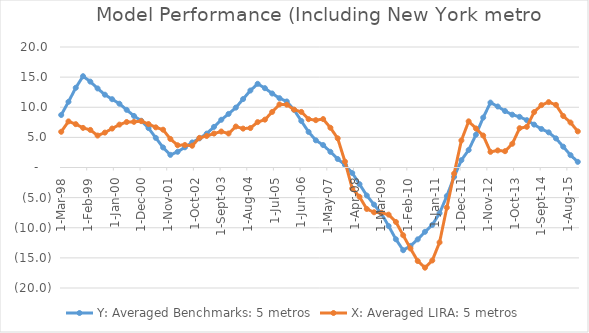
| Category | Y: Averaged Benchmarks: 5 metros | X: Averaged LIRA: 5 metros |
|---|---|---|
| 1998-03-31 | 8.719 | 5.93 |
| 1998-06-30 | 10.907 | 7.652 |
| 1998-09-30 | 13.227 | 7.194 |
| 1998-12-31 | 15.152 | 6.575 |
| 1999-03-31 | 14.253 | 6.238 |
| 1999-06-30 | 13.121 | 5.303 |
| 1999-09-30 | 12.085 | 5.792 |
| 1999-12-31 | 11.333 | 6.464 |
| 2000-03-31 | 10.584 | 7.117 |
| 2000-06-30 | 9.568 | 7.549 |
| 2000-09-30 | 8.555 | 7.576 |
| 2000-12-31 | 7.761 | 7.698 |
| 2001-03-31 | 6.541 | 7.214 |
| 2001-06-30 | 4.917 | 6.664 |
| 2001-09-30 | 3.326 | 6.272 |
| 2001-12-31 | 2.095 | 4.738 |
| 2002-03-31 | 2.609 | 3.693 |
| 2002-06-30 | 3.353 | 3.737 |
| 2002-09-30 | 4.157 | 3.612 |
| 2002-12-31 | 4.836 | 4.917 |
| 2003-03-31 | 5.626 | 5.236 |
| 2003-06-30 | 6.744 | 5.634 |
| 2003-09-30 | 7.921 | 5.972 |
| 2003-12-31 | 8.892 | 5.64 |
| 2004-03-31 | 9.94 | 6.8 |
| 2004-06-30 | 11.36 | 6.454 |
| 2004-09-30 | 12.776 | 6.55 |
| 2004-12-31 | 13.887 | 7.531 |
| 2005-03-31 | 13.164 | 7.944 |
| 2005-06-30 | 12.283 | 9.226 |
| 2005-09-30 | 11.505 | 10.472 |
| 2005-12-31 | 10.958 | 10.423 |
| 2006-03-31 | 9.57 | 9.604 |
| 2006-06-30 | 7.719 | 9.224 |
| 2006-09-30 | 5.907 | 8.02 |
| 2006-12-31 | 4.51 | 7.858 |
| 2007-03-31 | 3.724 | 8.038 |
| 2007-06-30 | 2.602 | 6.596 |
| 2007-09-30 | 1.414 | 4.838 |
| 2007-12-31 | 0.43 | 0.975 |
| 2008-03-31 | -0.913 | -3.481 |
| 2008-06-30 | -2.764 | -4.857 |
| 2008-09-30 | -4.651 | -6.88 |
| 2008-12-31 | -6.164 | -7.432 |
| 2009-03-31 | -7.629 | -7.513 |
| 2009-06-30 | -9.711 | -7.826 |
| 2009-09-30 | -11.909 | -9.037 |
| 2009-12-31 | -13.726 | -11.247 |
| 2010-03-31 | -13.014 | -13.44 |
| 2010-06-30 | -11.927 | -15.522 |
| 2010-09-30 | -10.67 | -16.626 |
| 2010-12-31 | -9.531 | -15.432 |
| 2011-03-31 | -7.595 | -12.431 |
| 2011-06-30 | -4.737 | -6.651 |
| 2011-09-30 | -1.56 | -1.014 |
| 2011-12-31 | 1.217 | 4.489 |
| 2012-03-31 | 2.9 | 7.662 |
| 2012-06-30 | 5.435 | 6.479 |
| 2012-09-30 | 8.286 | 5.306 |
| 2012-12-31 | 10.774 | 2.595 |
| 2013-03-31 | 10.125 | 2.832 |
| 2013-06-30 | 9.369 | 2.707 |
| 2013-09-30 | 8.767 | 3.939 |
| 2013-12-31 | 8.411 | 6.521 |
| 2014-03-31 | 7.859 | 6.751 |
| 2014-06-30 | 7.12 | 9.198 |
| 2014-09-30 | 6.395 | 10.355 |
| 2014-12-31 | 5.834 | 10.853 |
| 2015-03-31 | 4.831 | 10.395 |
| 2015-06-30 | 3.453 | 8.544 |
| 2015-09-30 | 2.055 | 7.467 |
| 2015-12-31 | 0.938 | 5.994 |